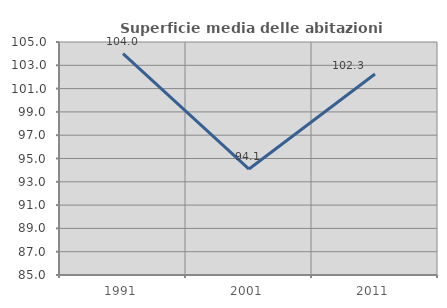
| Category | Superficie media delle abitazioni occupate |
|---|---|
| 1991.0 | 104 |
| 2001.0 | 94.093 |
| 2011.0 | 102.254 |